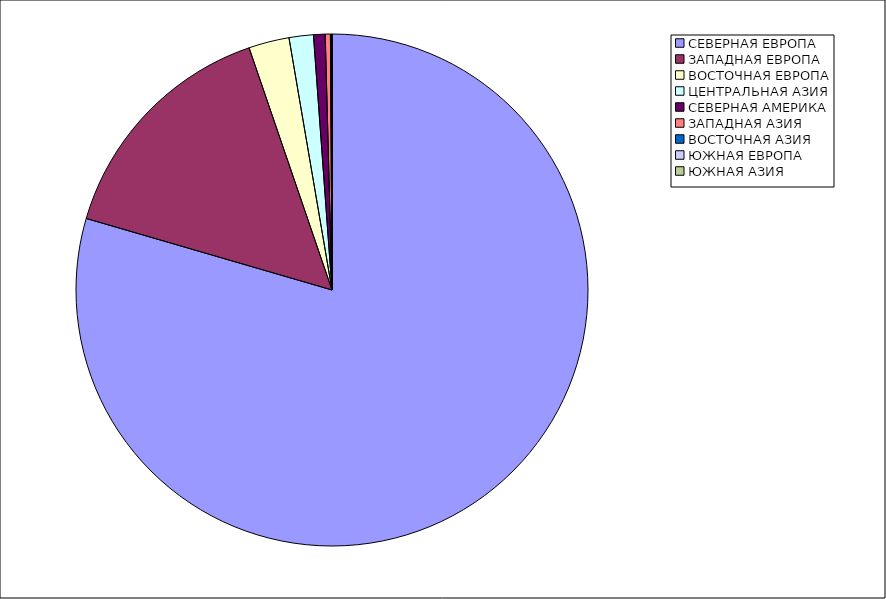
| Category | Оборот |
|---|---|
| СЕВЕРНАЯ ЕВРОПА | 79.508 |
| ЗАПАДНАЯ ЕВРОПА | 15.242 |
| ВОСТОЧНАЯ ЕВРОПА | 2.561 |
| ЦЕНТРАЛЬНАЯ АЗИЯ | 1.533 |
| СЕВЕРНАЯ АМЕРИКА | 0.734 |
| ЗАПАДНАЯ АЗИЯ | 0.324 |
| ВОСТОЧНАЯ АЗИЯ | 0.09 |
| ЮЖНАЯ ЕВРОПА | 0.007 |
| ЮЖНАЯ АЗИЯ | 0.002 |